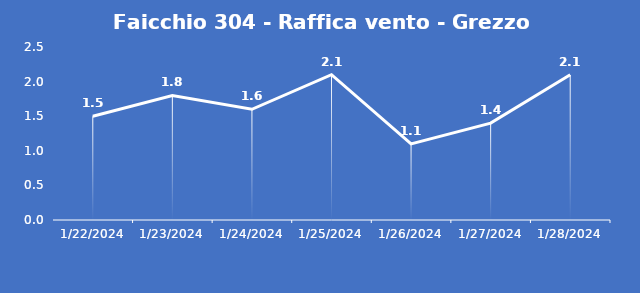
| Category | Faicchio 304 - Raffica vento - Grezzo (m/s) |
|---|---|
| 1/22/24 | 1.5 |
| 1/23/24 | 1.8 |
| 1/24/24 | 1.6 |
| 1/25/24 | 2.1 |
| 1/26/24 | 1.1 |
| 1/27/24 | 1.4 |
| 1/28/24 | 2.1 |